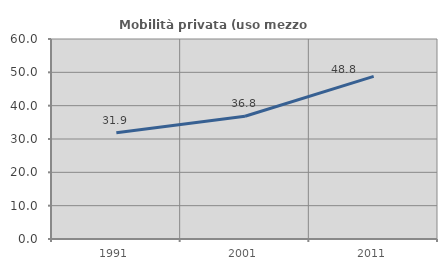
| Category | Mobilità privata (uso mezzo privato) |
|---|---|
| 1991.0 | 31.868 |
| 2001.0 | 36.842 |
| 2011.0 | 48.78 |